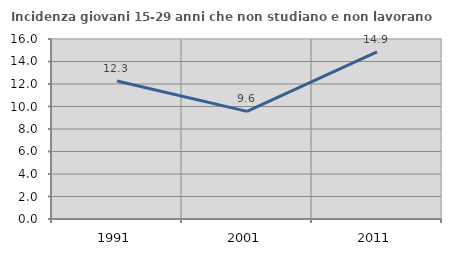
| Category | Incidenza giovani 15-29 anni che non studiano e non lavorano  |
|---|---|
| 1991.0 | 12.265 |
| 2001.0 | 9.57 |
| 2011.0 | 14.864 |